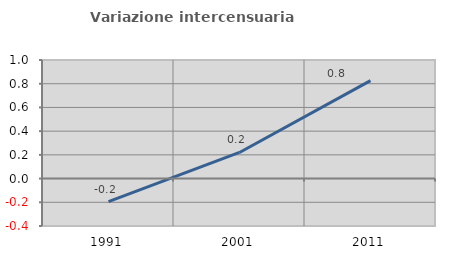
| Category | Variazione intercensuaria annua |
|---|---|
| 1991.0 | -0.194 |
| 2001.0 | 0.22 |
| 2011.0 | 0.826 |